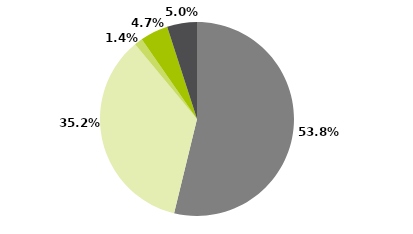
| Category | Series 0 |
|---|---|
| Multimercados Macro | 0.538 |
| Multimercados Livre | 0.352 |
| Multimercados L/S - Neutro | 0.014 |
| Multimercados L/S - Direcional | 0.047 |
| Outros | 0.05 |